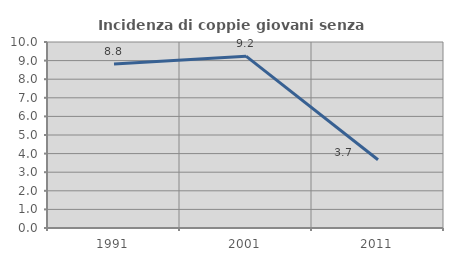
| Category | Incidenza di coppie giovani senza figli |
|---|---|
| 1991.0 | 8.817 |
| 2001.0 | 9.24 |
| 2011.0 | 3.667 |